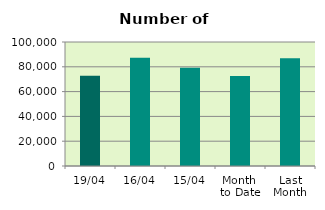
| Category | Series 0 |
|---|---|
| 19/04 | 72784 |
| 16/04 | 87296 |
| 15/04 | 79228 |
| Month 
to Date | 72487.091 |
| Last
Month | 86968.783 |